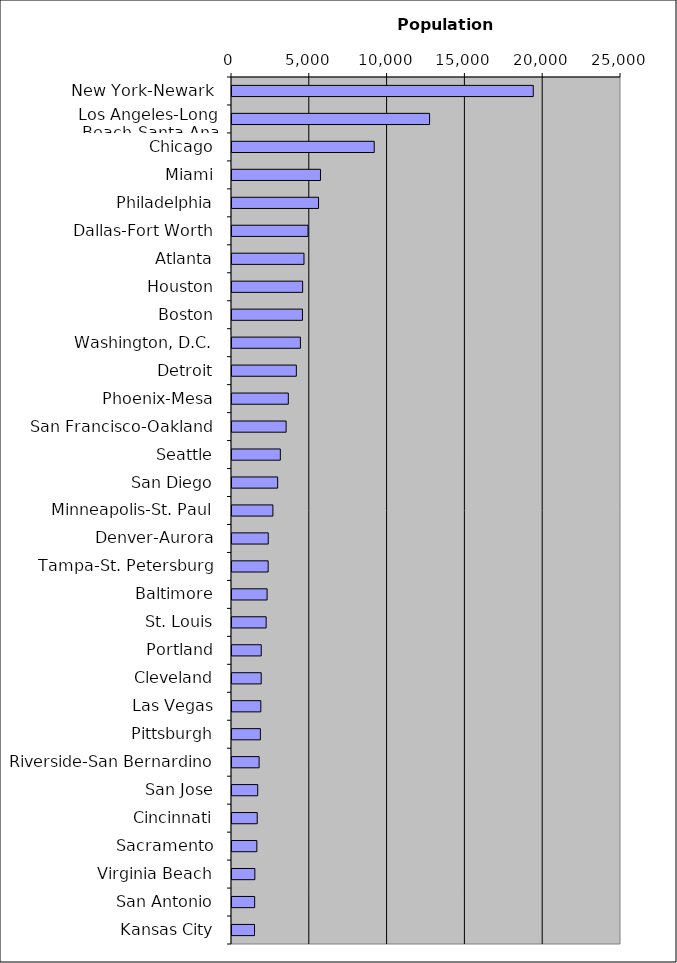
| Category | Series 0 |
|---|---|
| New York-Newark | 19425 |
| Los Angeles-Long Beach-Santa Ana | 12762 |
| Chicago | 9204 |
| Miami | 5750 |
| Philadelphia | 5626 |
| Dallas-Fort Worth | 4951 |
| Atlanta | 4691 |
| Houston | 4605 |
| Boston | 4593 |
| Washington, D.C. | 4460 |
| Detroit | 4200 |
| Phoenix-Mesa | 3684 |
| San Francisco-Oakland | 3541 |
| Seattle | 3171 |
| San Diego | 2999 |
| Minneapolis-St. Paul | 2693 |
| Denver-Aurora | 2394 |
| Tampa-St. Petersburg | 2387 |
| Baltimore | 2320 |
| St. Louis | 2259 |
| Portland | 1944 |
| Cleveland | 1942 |
| Las Vegas | 1916 |
| Pittsburgh | 1887 |
| Riverside-San Bernardino | 1807 |
| San Jose | 1718 |
| Cincinnati | 1686 |
| Sacramento | 1660 |
| Virginia Beach | 1534 |
| San Antonio | 1521 |
| Kansas City | 1513 |